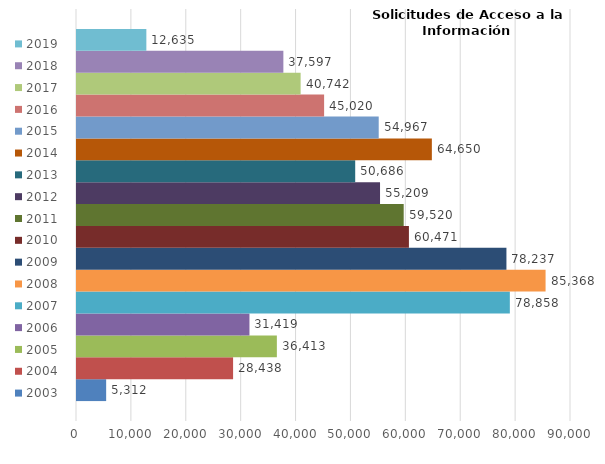
| Category | 2003 | 2004 | 2005 | 2006 | 2007 | 2008 | 2009 | 2010 | 2011 | 2012 | 2013 | 2014 | 2015 | 2016 | 2017 | 2018 | 2019 |
|---|---|---|---|---|---|---|---|---|---|---|---|---|---|---|---|---|---|
| 0 | 5312 | 28438 | 36413 | 31419 | 78858 | 85368 | 78237 | 60471 | 59520 | 55209 | 50686 | 64650 | 54967 | 45020 | 40742 | 37597 | 12635 |